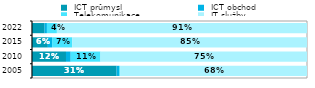
| Category |  ICT průmysl |  ICT obchod |  Telekomunikace |  IT služby  |
|---|---|---|---|---|
| 2005.0 | 0.308 | 0.009 | 0.003 | 0.68 |
| 2010.0 | 0.124 | 0.017 | 0.108 | 0.751 |
| 2015.0 | 0.058 | 0.015 | 0.073 | 0.854 |
| 2022.0 | 0.046 | 0.009 | 0.036 | 0.909 |